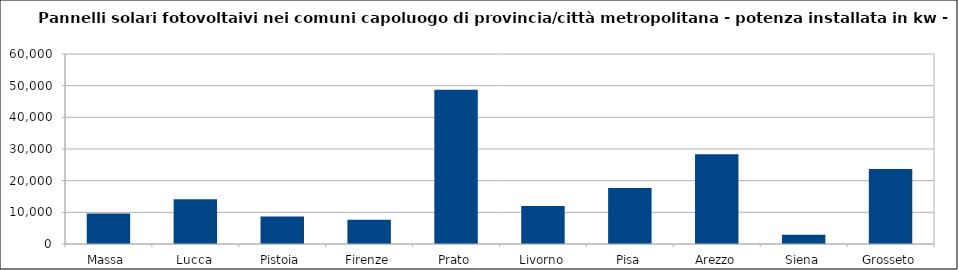
| Category | Series 0 |
|---|---|
| Massa | 9640.949 |
| Lucca | 14111.37 |
| Pistoia | 8674.625 |
| Firenze | 7674.29 |
| Prato | 48702.86 |
| Livorno | 12003.91 |
| Pisa | 17655.91 |
| Arezzo | 28350.33 |
| Siena | 2917.89 |
| Grosseto | 23707.735 |